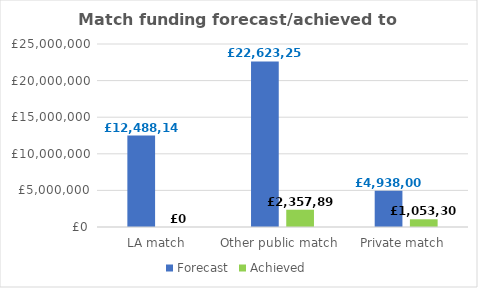
| Category | Forecast | Achieved |
|---|---|---|
| LA match  | 12488141 | 0 |
| Other public match  | 22623252 | 2357897 |
| Private match  | 4938000 | 1053309 |